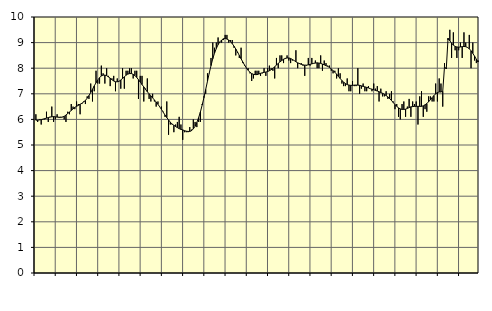
| Category | Piggar | Series 1 |
|---|---|---|
| nan | 6.2 | 5.97 |
| 1.0 | 5.9 | 5.97 |
| 1.0 | 6 | 5.98 |
| 1.0 | 5.8 | 5.99 |
| 1.0 | 6 | 6.01 |
| 1.0 | 6 | 6.03 |
| 1.0 | 6.3 | 6.05 |
| 1.0 | 5.9 | 6.07 |
| 1.0 | 6.1 | 6.09 |
| 1.0 | 6.5 | 6.1 |
| 1.0 | 5.9 | 6.11 |
| 1.0 | 6 | 6.1 |
| nan | 6.2 | 6.09 |
| 2.0 | 6.1 | 6.08 |
| 2.0 | 6.1 | 6.08 |
| 2.0 | 6.1 | 6.09 |
| 2.0 | 6 | 6.12 |
| 2.0 | 5.9 | 6.17 |
| 2.0 | 6.3 | 6.23 |
| 2.0 | 6.2 | 6.29 |
| 2.0 | 6.6 | 6.35 |
| 2.0 | 6.5 | 6.41 |
| 2.0 | 6.4 | 6.47 |
| 2.0 | 6.7 | 6.51 |
| nan | 6.6 | 6.55 |
| 3.0 | 6.2 | 6.59 |
| 3.0 | 6.6 | 6.63 |
| 3.0 | 6.7 | 6.68 |
| 3.0 | 6.6 | 6.74 |
| 3.0 | 6.9 | 6.83 |
| 3.0 | 6.8 | 6.93 |
| 3.0 | 7.4 | 7.05 |
| 3.0 | 6.7 | 7.18 |
| 3.0 | 7.1 | 7.31 |
| 3.0 | 7.9 | 7.43 |
| 3.0 | 7.4 | 7.54 |
| nan | 7.4 | 7.63 |
| 4.0 | 8.1 | 7.7 |
| 4.0 | 7.8 | 7.73 |
| 4.0 | 7.4 | 7.73 |
| 4.0 | 8 | 7.71 |
| 4.0 | 7.7 | 7.66 |
| 4.0 | 7.3 | 7.61 |
| 4.0 | 7.6 | 7.55 |
| 4.0 | 7.7 | 7.5 |
| 4.0 | 7.1 | 7.47 |
| 4.0 | 7.6 | 7.47 |
| 4.0 | 7.5 | 7.49 |
| nan | 7.2 | 7.54 |
| 5.0 | 8 | 7.6 |
| 5.0 | 7.2 | 7.66 |
| 5.0 | 7.9 | 7.73 |
| 5.0 | 7.9 | 7.77 |
| 5.0 | 8 | 7.79 |
| 5.0 | 8 | 7.79 |
| 5.0 | 7.6 | 7.76 |
| 5.0 | 7.9 | 7.71 |
| 5.0 | 7.9 | 7.64 |
| 5.0 | 6.8 | 7.55 |
| 5.0 | 7.7 | 7.46 |
| nan | 7.7 | 7.36 |
| 6.0 | 6.7 | 7.27 |
| 6.0 | 7.2 | 7.17 |
| 6.0 | 7.6 | 7.08 |
| 6.0 | 6.8 | 7 |
| 6.0 | 6.7 | 6.92 |
| 6.0 | 7 | 6.84 |
| 6.0 | 6.7 | 6.76 |
| 6.0 | 6.5 | 6.68 |
| 6.0 | 6.7 | 6.59 |
| 6.0 | 6.5 | 6.49 |
| 6.0 | 6.5 | 6.39 |
| nan | 6.3 | 6.28 |
| 7.0 | 6.1 | 6.17 |
| 7.0 | 6.7 | 6.07 |
| 7.0 | 5.4 | 5.98 |
| 7.0 | 5.8 | 5.89 |
| 7.0 | 5.8 | 5.82 |
| 7.0 | 5.5 | 5.77 |
| 7.0 | 5.8 | 5.72 |
| 7.0 | 5.9 | 5.68 |
| 7.0 | 6.1 | 5.64 |
| 7.0 | 5.8 | 5.61 |
| 7.0 | 5.2 | 5.59 |
| nan | 5.5 | 5.56 |
| 8.0 | 5.5 | 5.54 |
| 8.0 | 5.5 | 5.53 |
| 8.0 | 5.7 | 5.53 |
| 8.0 | 5.6 | 5.56 |
| 8.0 | 6 | 5.63 |
| 8.0 | 5.9 | 5.73 |
| 8.0 | 5.7 | 5.88 |
| 8.0 | 5.9 | 6.07 |
| 8.0 | 5.9 | 6.29 |
| 8.0 | 6.6 | 6.56 |
| 8.0 | 6.9 | 6.85 |
| nan | 7 | 7.17 |
| 9.0 | 7.8 | 7.49 |
| 9.0 | 7.8 | 7.81 |
| 9.0 | 8.4 | 8.1 |
| 9.0 | 9 | 8.37 |
| 9.0 | 8.8 | 8.59 |
| 9.0 | 9 | 8.77 |
| 9.0 | 9.2 | 8.92 |
| 9.0 | 9 | 9.03 |
| 9.0 | 9 | 9.1 |
| 9.0 | 9.1 | 9.15 |
| 9.0 | 9.3 | 9.16 |
| nan | 9.3 | 9.14 |
| 10.0 | 9 | 9.1 |
| 10.0 | 9.1 | 9.04 |
| 10.0 | 9.1 | 8.96 |
| 10.0 | 8.8 | 8.86 |
| 10.0 | 8.5 | 8.75 |
| 10.0 | 8.6 | 8.63 |
| 10.0 | 8.4 | 8.5 |
| 10.0 | 8.8 | 8.37 |
| 10.0 | 8.2 | 8.24 |
| 10.0 | 8.1 | 8.12 |
| 10.0 | 8 | 8.01 |
| nan | 8 | 7.92 |
| 11.0 | 7.8 | 7.84 |
| 11.0 | 7.5 | 7.79 |
| 11.0 | 7.6 | 7.76 |
| 11.0 | 7.9 | 7.75 |
| 11.0 | 7.9 | 7.75 |
| 11.0 | 7.9 | 7.77 |
| 11.0 | 7.7 | 7.8 |
| 11.0 | 7.8 | 7.82 |
| 11.0 | 8 | 7.84 |
| 11.0 | 7.7 | 7.85 |
| 11.0 | 8 | 7.87 |
| nan | 8.1 | 7.9 |
| 12.0 | 8 | 7.94 |
| 12.0 | 7.9 | 7.99 |
| 12.0 | 7.6 | 8.06 |
| 12.0 | 8.4 | 8.12 |
| 12.0 | 8 | 8.19 |
| 12.0 | 8.5 | 8.25 |
| 12.0 | 8.5 | 8.3 |
| 12.0 | 8.2 | 8.35 |
| 12.0 | 8.4 | 8.38 |
| 12.0 | 8.5 | 8.4 |
| 12.0 | 8.3 | 8.4 |
| nan | 8.2 | 8.38 |
| 13.0 | 8.3 | 8.34 |
| 13.0 | 8.3 | 8.3 |
| 13.0 | 8.7 | 8.25 |
| 13.0 | 8 | 8.21 |
| 13.0 | 8.2 | 8.18 |
| 13.0 | 8.2 | 8.15 |
| 13.0 | 8.1 | 8.13 |
| 13.0 | 7.7 | 8.12 |
| 13.0 | 8.1 | 8.12 |
| 13.0 | 8.4 | 8.13 |
| 13.0 | 8.1 | 8.15 |
| nan | 8.4 | 8.17 |
| 14.0 | 8.2 | 8.19 |
| 14.0 | 8.3 | 8.2 |
| 14.0 | 8 | 8.21 |
| 14.0 | 8 | 8.2 |
| 14.0 | 8.5 | 8.19 |
| 14.0 | 7.9 | 8.16 |
| 14.0 | 8.3 | 8.13 |
| 14.0 | 8.2 | 8.1 |
| 14.0 | 8.1 | 8.07 |
| 14.0 | 8.1 | 8.03 |
| 14.0 | 7.9 | 7.97 |
| nan | 7.8 | 7.91 |
| 15.0 | 7.9 | 7.84 |
| 15.0 | 7.6 | 7.77 |
| 15.0 | 8 | 7.68 |
| 15.0 | 7.8 | 7.6 |
| 15.0 | 7.4 | 7.52 |
| 15.0 | 7.3 | 7.45 |
| 15.0 | 7.3 | 7.4 |
| 15.0 | 7.6 | 7.36 |
| 15.0 | 7.1 | 7.34 |
| 15.0 | 7.1 | 7.33 |
| 15.0 | 7.5 | 7.33 |
| nan | 7.3 | 7.34 |
| 16.0 | 7.3 | 7.34 |
| 16.0 | 8 | 7.34 |
| 16.0 | 7 | 7.33 |
| 16.0 | 7.2 | 7.31 |
| 16.0 | 7.4 | 7.29 |
| 16.0 | 7.1 | 7.27 |
| 16.0 | 7.1 | 7.25 |
| 16.0 | 7.3 | 7.23 |
| 16.0 | 7.2 | 7.2 |
| 16.0 | 7.1 | 7.18 |
| 16.0 | 7.4 | 7.16 |
| nan | 7.2 | 7.13 |
| 17.0 | 7.3 | 7.11 |
| 17.0 | 6.7 | 7.08 |
| 17.0 | 7.2 | 7.05 |
| 17.0 | 6.9 | 7.02 |
| 17.0 | 6.9 | 6.98 |
| 17.0 | 7.1 | 6.93 |
| 17.0 | 6.8 | 6.88 |
| 17.0 | 7 | 6.81 |
| 17.0 | 7.1 | 6.74 |
| 17.0 | 6.7 | 6.66 |
| 17.0 | 6.4 | 6.58 |
| nan | 6.6 | 6.51 |
| 18.0 | 6.1 | 6.45 |
| 18.0 | 6 | 6.41 |
| 18.0 | 6.6 | 6.39 |
| 18.0 | 6.7 | 6.39 |
| 18.0 | 6.1 | 6.4 |
| 18.0 | 6.5 | 6.43 |
| 18.0 | 6.8 | 6.46 |
| 18.0 | 6.1 | 6.49 |
| 18.0 | 6.7 | 6.5 |
| 18.0 | 6.6 | 6.51 |
| 18.0 | 6.7 | 6.51 |
| nan | 5.8 | 6.51 |
| 19.0 | 6.9 | 6.51 |
| 19.0 | 7.1 | 6.51 |
| 19.0 | 6.1 | 6.53 |
| 19.0 | 6.4 | 6.57 |
| 19.0 | 6.3 | 6.62 |
| 19.0 | 6.9 | 6.69 |
| 19.0 | 6.9 | 6.77 |
| 19.0 | 6.7 | 6.85 |
| 19.0 | 6.7 | 6.93 |
| 19.0 | 7.4 | 7 |
| 19.0 | 6.7 | 7.05 |
| nan | 7.6 | 7.07 |
| 20.0 | 7.4 | 7.07 |
| 20.0 | 6.5 | 7.1 |
| 20.0 | 8.2 | 8.06 |
| 20.0 | 8 | 7.97 |
| 20.0 | 9.1 | 9.17 |
| 20.0 | 9.5 | 9.07 |
| 20.0 | 8.4 | 8.98 |
| 20.0 | 9.4 | 8.9 |
| 20.0 | 8.7 | 8.85 |
| 20.0 | 8.4 | 8.83 |
| 20.0 | 8.7 | 8.82 |
| nan | 9 | 8.83 |
| 21.0 | 8.4 | 8.84 |
| 21.0 | 9.4 | 8.85 |
| 21.0 | 9 | 8.84 |
| 21.0 | 8.8 | 8.81 |
| 21.0 | 9.3 | 8.76 |
| 21.0 | 8 | 8.68 |
| 21.0 | 9 | 8.58 |
| 21.0 | 8.3 | 8.47 |
| 21.0 | 8.2 | 8.35 |
| 21.0 | 8.3 | 8.24 |